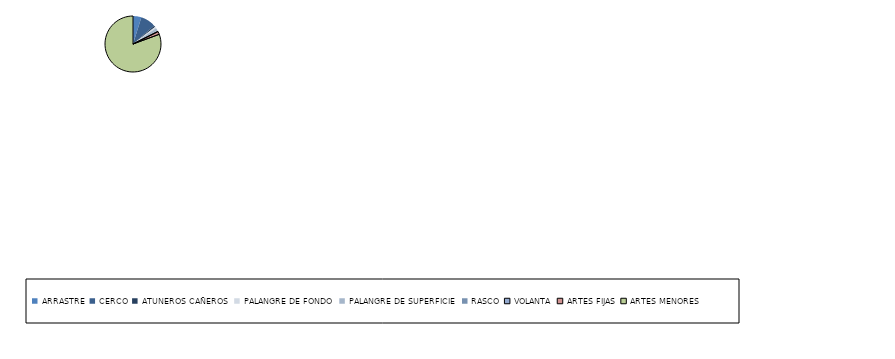
| Category | Series 0 |
|---|---|
| ARRASTRE | 11 |
| CERCO | 20 |
| ATUNEROS CAÑEROS | 2 |
| PALANGRE DE FONDO | 2 |
| PALANGRE DE SUPERFICIE | 4 |
| RASCO | 1 |
| VOLANTA | 0 |
| ARTES FIJAS | 4 |
| ARTES MENORES | 183 |